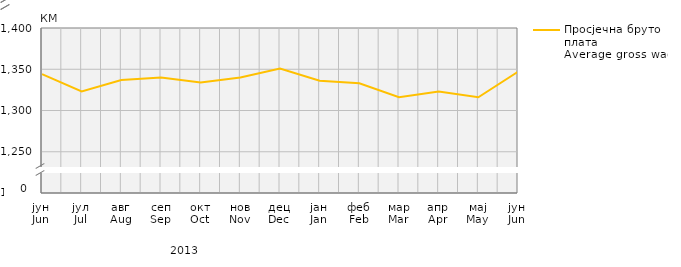
| Category | Просјечна бруто плата
Average gross wage |
|---|---|
| јун
Jun | 1344 |
| јул
Jul | 1323 |
| авг
Aug | 1337 |
| сеп
Sep | 1340 |
| окт
Oct | 1334 |
| нов
Nov | 1340 |
| дец
Dec | 1351 |
| јан
Jan | 1336 |
| феб
Feb | 1333 |
| мар
Mar | 1316 |
| апр
Apr | 1323 |
| мај
May | 1316 |
| јун
Jun | 1347 |